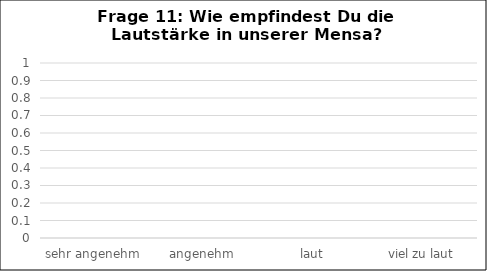
| Category | Series 0 |
|---|---|
| sehr angenehm | 0 |
| angenehm | 0 |
| laut | 0 |
| viel zu laut | 0 |